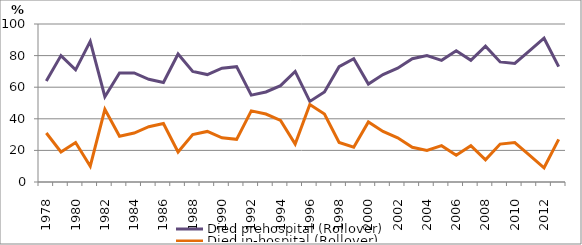
| Category | Died prehospital (Rollover) | Died in-hospital (Rollover) |
|---|---|---|
| 1978.0 | 64 | 31 |
| 1979.0 | 80 | 19 |
| 1980.0 | 71 | 25 |
| 1981.0 | 89 | 10 |
| 1982.0 | 54 | 46 |
| 1983.0 | 69 | 29 |
| 1984.0 | 69 | 31 |
| 1985.0 | 65 | 35 |
| 1986.0 | 63 | 37 |
| 1987.0 | 81 | 19 |
| 1988.0 | 70 | 30 |
| 1989.0 | 68 | 32 |
| 1990.0 | 72 | 28 |
| 1991.0 | 73 | 27 |
| 1992.0 | 55 | 45 |
| 1993.0 | 57 | 43 |
| 1994.0 | 61 | 39 |
| 1995.0 | 70 | 24 |
| 1996.0 | 51 | 49 |
| 1997.0 | 57 | 43 |
| 1998.0 | 73 | 25 |
| 1999.0 | 78 | 22 |
| 2000.0 | 62 | 38 |
| 2001.0 | 68 | 32 |
| 2002.0 | 72 | 28 |
| 2003.0 | 78 | 22 |
| 2004.0 | 80 | 20 |
| 2005.0 | 77 | 23 |
| 2006.0 | 83 | 17 |
| 2007.0 | 77 | 23 |
| 2008.0 | 86 | 14 |
| 2009.0 | 76 | 24 |
| 2010.0 | 75 | 25 |
| 2011.0 | 83 | 17 |
| 2012.0 | 91 | 9 |
| 2013.0 | 73 | 27 |